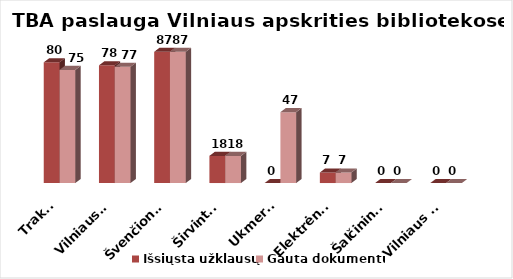
| Category | Išsiųsta užklausų | Gauta dokumentų |
|---|---|---|
| Trakai | 80 | 75 |
| Vilniaus r. | 78 | 77 |
| Švenčionys | 87 | 87 |
| Širvintos | 18 | 18 |
| Ukmergė | 0 | 47 |
| Elektrėnai | 7 | 7 |
| Šalčininkai | 0 | 0 |
| Vilniaus m. | 0 | 0 |